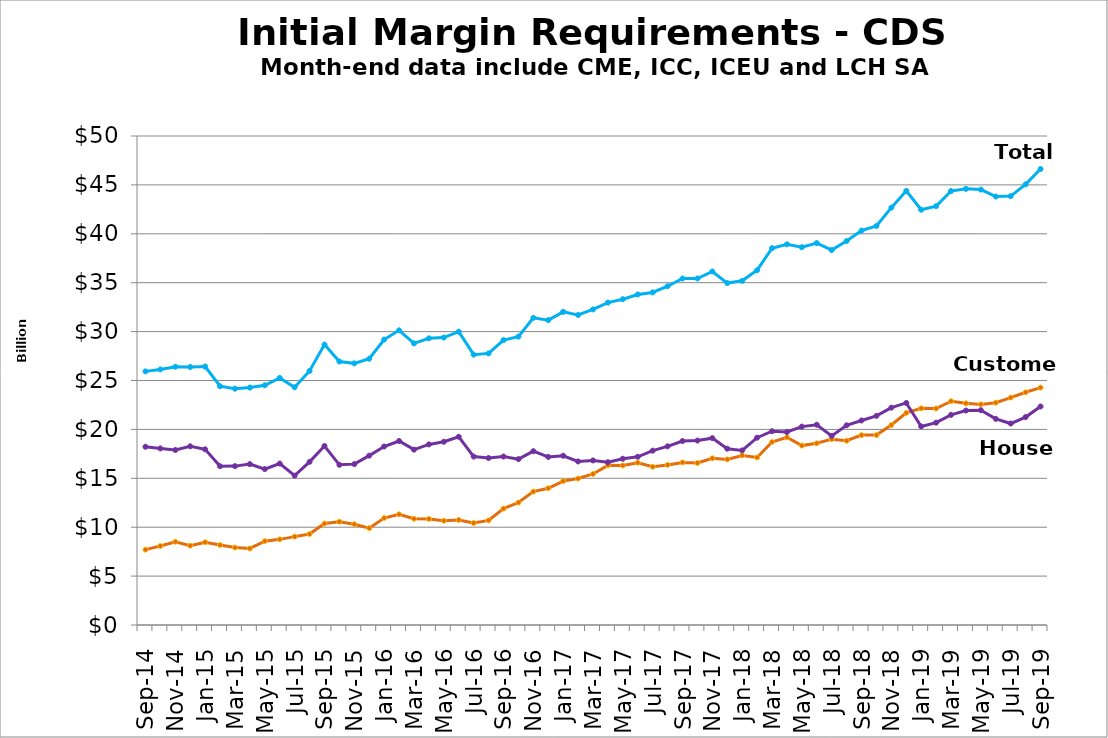
| Category | Customer | House | Total |
|---|---|---|---|
| 2014-09-30 |  |  |  |
| nan |  |  |  |
| 2014-11-28 |  |  |  |
| nan |  |  |  |
| 2015-01-30 |  |  |  |
| nan |  |  |  |
| 2015-03-31 |  |  |  |
| nan |  |  |  |
| 2015-05-29 |  |  |  |
| nan |  |  |  |
| 2015-07-31 |  |  |  |
| nan |  |  |  |
| 2015-09-30 |  |  |  |
| nan |  |  |  |
| 2015-11-30 |  |  |  |
| nan |  |  |  |
| 2016-01-29 |  |  |  |
| nan |  |  |  |
| 2016-03-31 |  |  |  |
| nan |  |  |  |
| 2016-05-31 |  |  |  |
| nan |  |  |  |
| 2016-07-29 |  |  |  |
| nan |  |  |  |
| 2016-09-30 |  |  |  |
| nan |  |  |  |
| 2016-11-30 |  |  |  |
| nan |  |  |  |
| 2017-01-31 |  |  |  |
| nan |  |  |  |
| 2017-03-31 |  |  |  |
| nan |  |  |  |
| 2017-05-31 |  |  |  |
| nan |  |  |  |
| 2017-07-31 |  |  |  |
| nan |  |  |  |
| 2017-09-29 |  |  |  |
| nan |  |  |  |
| 2017-11-30 |  |  |  |
| nan |  |  |  |
| 2018-01-31 |  |  |  |
| nan |  |  |  |
| 2018-03-29 |  |  |  |
| nan |  |  |  |
| 2018-05-31 |  |  |  |
| nan |  |  |  |
| 2018-07-31 |  |  |  |
| nan |  |  |  |
| 2018-09-28 |  |  |  |
| nan |  |  |  |
| 2018-11-30 |  |  |  |
| nan |  |  |  |
| 2019-01-31 |  |  |  |
| nan |  |  |  |
| 2019-03-29 |  |  |  |
| nan |  |  |  |
| 2019-05-31 |  |  |  |
| nan |  |  |  |
| 2019-07-31 |  |  |  |
| nan |  |  |  |
| 2019-09-30 |  |  |  |